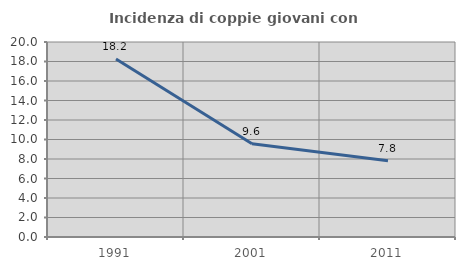
| Category | Incidenza di coppie giovani con figli |
|---|---|
| 1991.0 | 18.248 |
| 2001.0 | 9.554 |
| 2011.0 | 7.82 |